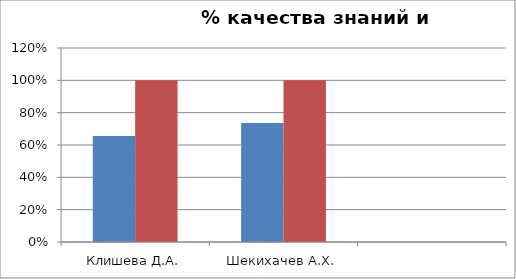
| Category | Series 0 | 2 |
|---|---|---|
| Клишева Д.А. | 0.656 | 1 |
| Шекихачев А.Х. | 0.736 | 1 |